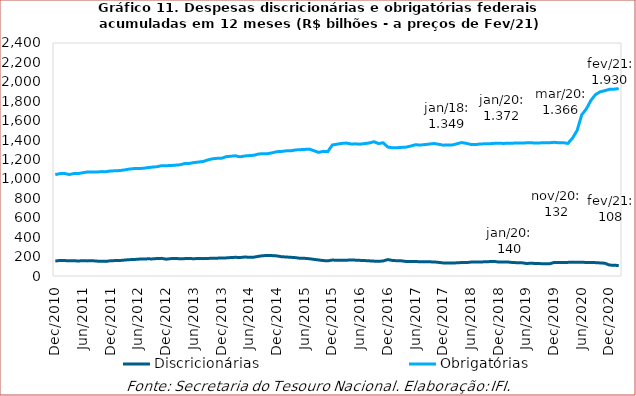
| Category | Discricionárias | Obrigatórias |
|---|---|---|
| 2010-12-01 | 153804.501 | 1044517.422 |
| 2011-01-01 | 160731.837 | 1054457.406 |
| 2011-02-01 | 159129.106 | 1056005.006 |
| 2011-03-01 | 156321.223 | 1045421.084 |
| 2011-04-01 | 156748.243 | 1054876.918 |
| 2011-05-01 | 155006.43 | 1055261.462 |
| 2011-06-01 | 157185.025 | 1063982.242 |
| 2011-07-01 | 155679.933 | 1071857.616 |
| 2011-08-01 | 157608.598 | 1070636.814 |
| 2011-09-01 | 153292.309 | 1070806.137 |
| 2011-10-01 | 152255.269 | 1075221.388 |
| 2011-11-01 | 150502.661 | 1074612.261 |
| 2011-12-01 | 157640.588 | 1082721.112 |
| 2012-01-01 | 158608.018 | 1082908.376 |
| 2012-02-01 | 159578.184 | 1086430.625 |
| 2012-03-01 | 164075.42 | 1092764.338 |
| 2012-04-01 | 168338 | 1100937.908 |
| 2012-05-01 | 169789.588 | 1106275.237 |
| 2012-06-01 | 173500.303 | 1106648.384 |
| 2012-07-01 | 175543.143 | 1109299.45 |
| 2012-08-01 | 176542.943 | 1116120.657 |
| 2012-09-01 | 176232.367 | 1121585.164 |
| 2012-10-01 | 179699.289 | 1125356.508 |
| 2012-11-01 | 181740.23 | 1136288.669 |
| 2012-12-01 | 173085.864 | 1136357.235 |
| 2013-01-01 | 178918.636 | 1137614.055 |
| 2013-02-01 | 180989.598 | 1141519.646 |
| 2013-03-01 | 177556.798 | 1145456.031 |
| 2013-04-01 | 178944.781 | 1157803.096 |
| 2013-05-01 | 180021.34 | 1159112.489 |
| 2013-06-01 | 178290.082 | 1168446.724 |
| 2013-07-01 | 180136.537 | 1173672.889 |
| 2013-08-01 | 178854.832 | 1179744.421 |
| 2013-09-01 | 181205.822 | 1194667.972 |
| 2013-10-01 | 182231.518 | 1207000.821 |
| 2013-11-01 | 183676.388 | 1211758.231 |
| 2013-12-01 | 185701.911 | 1212131.187 |
| 2014-01-01 | 186472.51 | 1229468.575 |
| 2014-02-01 | 190100.429 | 1233504.743 |
| 2014-03-01 | 192429.009 | 1238101.81 |
| 2014-04-01 | 190170.597 | 1227475.958 |
| 2014-05-01 | 195225.694 | 1236164.272 |
| 2014-06-01 | 193481.026 | 1240019.285 |
| 2014-07-01 | 194137.498 | 1243694.307 |
| 2014-08-01 | 202491.508 | 1256545.902 |
| 2014-09-01 | 209676.108 | 1260191.778 |
| 2014-10-01 | 210266.913 | 1260340.864 |
| 2014-11-01 | 209874.346 | 1268951.37 |
| 2014-12-01 | 206916.187 | 1280502.628 |
| 2015-01-01 | 198384.807 | 1283310.318 |
| 2015-02-01 | 195975.509 | 1288895.132 |
| 2015-03-01 | 192504.154 | 1289846.879 |
| 2015-04-01 | 189129.729 | 1298281.409 |
| 2015-05-01 | 182460.937 | 1301158.188 |
| 2015-06-01 | 182064.667 | 1303885.662 |
| 2015-07-01 | 177828.537 | 1307004.109 |
| 2015-08-01 | 171614.712 | 1290613.39 |
| 2015-09-01 | 165119.679 | 1273506.817 |
| 2015-10-01 | 159169.079 | 1283859.276 |
| 2015-11-01 | 156079.297 | 1281263.492 |
| 2015-12-01 | 164602.053 | 1349966.398 |
| 2016-01-01 | 161566.76 | 1357609.688 |
| 2016-02-01 | 162608.785 | 1365428.4 |
| 2016-03-01 | 162735.125 | 1369341.138 |
| 2016-04-01 | 164897.42 | 1360428.175 |
| 2016-05-01 | 163332.242 | 1361128.846 |
| 2016-06-01 | 160973.438 | 1357892.139 |
| 2016-07-01 | 158998.794 | 1364003.402 |
| 2016-08-01 | 156106.533 | 1370218.544 |
| 2016-09-01 | 153160.865 | 1383255.127 |
| 2016-10-01 | 151098.04 | 1364187.566 |
| 2016-11-01 | 154969.21 | 1372072.021 |
| 2016-12-01 | 169147.086 | 1328476.065 |
| 2017-01-01 | 160464.831 | 1320260.62 |
| 2017-02-01 | 157033.488 | 1321405.811 |
| 2017-03-01 | 155814.547 | 1324779.358 |
| 2017-04-01 | 149512.829 | 1327556.807 |
| 2017-05-01 | 150406.374 | 1338831.438 |
| 2017-06-01 | 149085.826 | 1351999.147 |
| 2017-07-01 | 146893.592 | 1348640.752 |
| 2017-08-01 | 146652.69 | 1353523.7 |
| 2017-09-01 | 145793.07 | 1358832.61 |
| 2017-10-01 | 145031.406 | 1364822.037 |
| 2017-11-01 | 140191.352 | 1357240.716 |
| 2017-12-01 | 134600.673 | 1347820.368 |
| 2018-01-01 | 135086.555 | 1349264.224 |
| 2018-02-01 | 133615.368 | 1350089.229 |
| 2018-03-01 | 135828.045 | 1362346.528 |
| 2018-04-01 | 138987.303 | 1374707.903 |
| 2018-05-01 | 138076.73 | 1366739.624 |
| 2018-06-01 | 143282.051 | 1354999.842 |
| 2018-07-01 | 144682.415 | 1353364.796 |
| 2018-08-01 | 144853.674 | 1360178.949 |
| 2018-09-01 | 145854.054 | 1361393.266 |
| 2018-10-01 | 148232.757 | 1361979.396 |
| 2018-11-01 | 150731.564 | 1366068.482 |
| 2018-12-01 | 143688.034 | 1367643.54 |
| 2019-01-01 | 143053.355 | 1365505.666 |
| 2019-02-01 | 143921.839 | 1367188.408 |
| 2019-03-01 | 139051.568 | 1367886.3 |
| 2019-04-01 | 137119.108 | 1370450.347 |
| 2019-05-01 | 136520.635 | 1369377.225 |
| 2019-06-01 | 129305.043 | 1371668.211 |
| 2019-07-01 | 130756.191 | 1372952.025 |
| 2019-08-01 | 129502.202 | 1368780.042 |
| 2019-09-01 | 127565.974 | 1371096.006 |
| 2019-10-01 | 125739.598 | 1372897.33 |
| 2019-11-01 | 125161.656 | 1372459.56 |
| 2019-12-01 | 139219.414 | 1377122.338 |
| 2020-01-01 | 139965.031 | 1372448.989 |
| 2020-02-01 | 139537.809 | 1373404.199 |
| 2020-03-01 | 140295.53 | 1365887.354 |
| 2020-04-01 | 142979.773 | 1420217.521 |
| 2020-05-01 | 141246.161 | 1499365.975 |
| 2020-06-01 | 142332.677 | 1660176.514 |
| 2020-07-01 | 139101.98 | 1721468.244 |
| 2020-08-01 | 138848.607 | 1810369.568 |
| 2020-09-01 | 137665.695 | 1869371.743 |
| 2020-10-01 | 134638.729 | 1897679.215 |
| 2020-11-01 | 131626.789 | 1908736.359 |
| 2020-12-01 | 112650.854 | 1923082.396 |
| 2021-01-01 | 110718.637 | 1924614.332 |
| 2021-02-01 | 108100.916 | 1929862.715 |